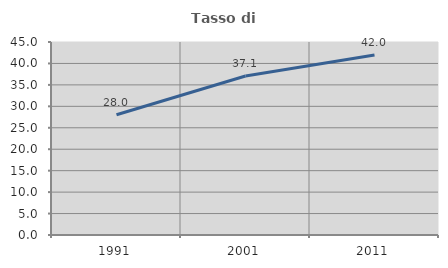
| Category | Tasso di occupazione   |
|---|---|
| 1991.0 | 28.028 |
| 2001.0 | 37.07 |
| 2011.0 | 41.987 |